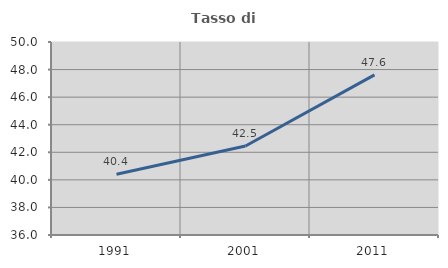
| Category | Tasso di occupazione   |
|---|---|
| 1991.0 | 40.405 |
| 2001.0 | 42.458 |
| 2011.0 | 47.611 |